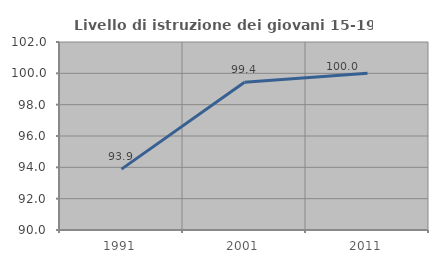
| Category | Livello di istruzione dei giovani 15-19 anni |
|---|---|
| 1991.0 | 93.886 |
| 2001.0 | 99.435 |
| 2011.0 | 100 |